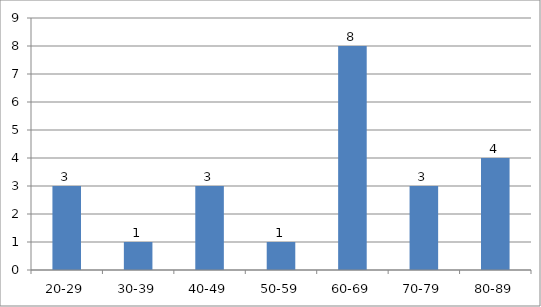
| Category | Series 0 |
|---|---|
| 20-29 | 3 |
| 30-39 | 1 |
| 40-49 | 3 |
| 50-59 | 1 |
| 60-69 | 8 |
| 70-79 | 3 |
| 80-89 | 4 |